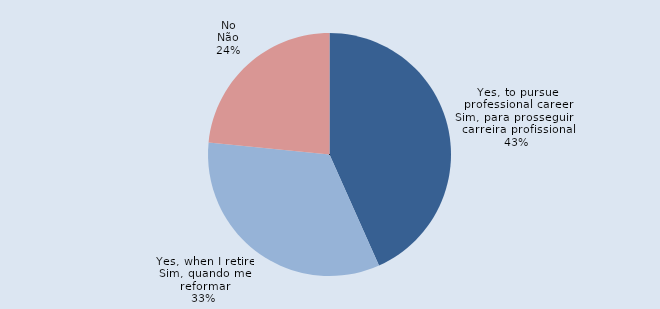
| Category | Series 0 |
|---|---|
| Yes, to pursue professional career
Sim, para prosseguir a carreira profissional | 159 |
| Yes, when I retire
Sim, quando me reformar | 122 |
| No
Não | 86 |